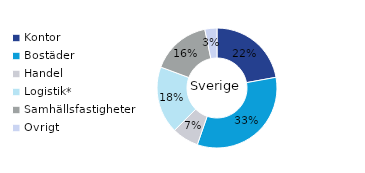
| Category | Sverige |
|---|---|
| Kontor | 0.221 |
| Bostäder | 0.332 |
| Handel | 0.072 |
| Logistik* | 0.181 |
| Samhällsfastigheter | 0.161 |
| Övrigt | 0.033 |